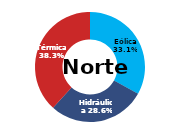
| Category | Norte |
|---|---|
| Eólica | 95.169 |
| Hidráulica | 82.271 |
| Solar | 0 |
| Térmica | 110.068 |